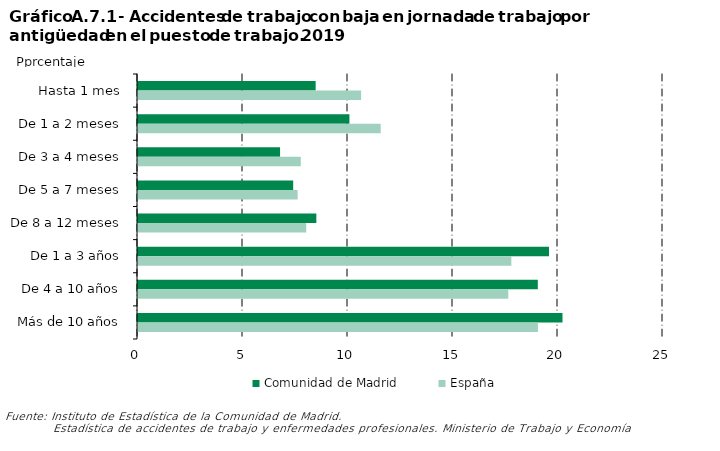
| Category | Comunidad de Madrid | España |
|---|---|---|
| 0 | 8.46 | 10.624 |
| 1 | 10.068 | 11.557 |
| 2 | 6.766 | 7.752 |
| 3 | 7.39 | 7.603 |
| 4 | 8.492 | 8.01 |
| 5 | 19.571 | 17.778 |
| 6 | 19.039 | 17.633 |
| 7 | 20.214 | 19.044 |